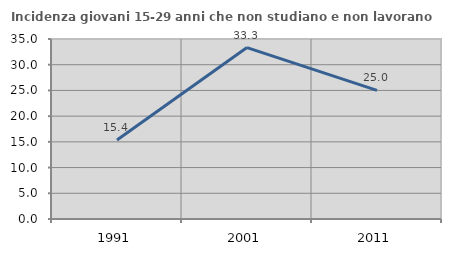
| Category | Incidenza giovani 15-29 anni che non studiano e non lavorano  |
|---|---|
| 1991.0 | 15.35 |
| 2001.0 | 33.333 |
| 2011.0 | 25 |